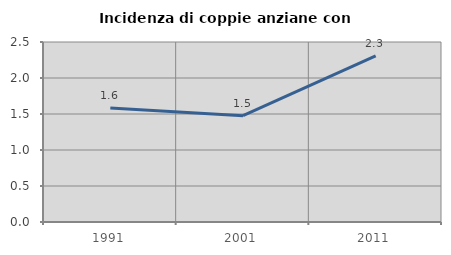
| Category | Incidenza di coppie anziane con figli |
|---|---|
| 1991.0 | 1.583 |
| 2001.0 | 1.476 |
| 2011.0 | 2.309 |